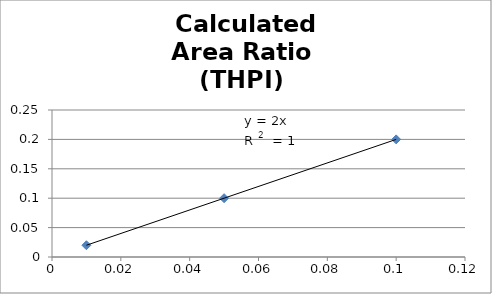
| Category | Calculated
Area Ratio 
(THPI)  |
|---|---|
| 0.01 | 0.02 |
| 0.05 | 0.1 |
| 0.1 | 0.2 |